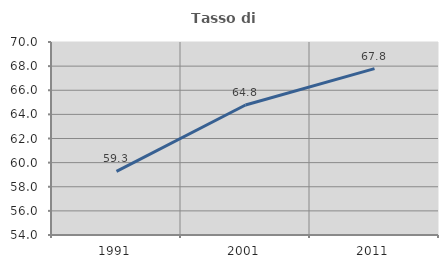
| Category | Tasso di occupazione   |
|---|---|
| 1991.0 | 59.274 |
| 2001.0 | 64.778 |
| 2011.0 | 67.795 |